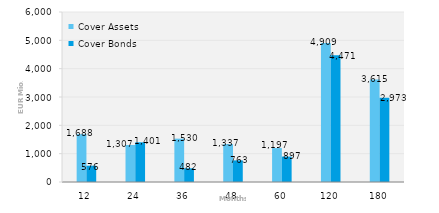
| Category | Cover Assets | Cover Bonds |
|---|---|---|
| 12.0 | 1687.984 | 575.714 |
| 24.0 | 1306.804 | 1400.628 |
| 36.0 | 1529.972 | 482.215 |
| 48.0 | 1336.762 | 762.725 |
| 60.0 | 1196.958 | 897.029 |
| 120.0 | 4908.911 | 4471.48 |
| 180.0 | 3615.397 | 2972.549 |